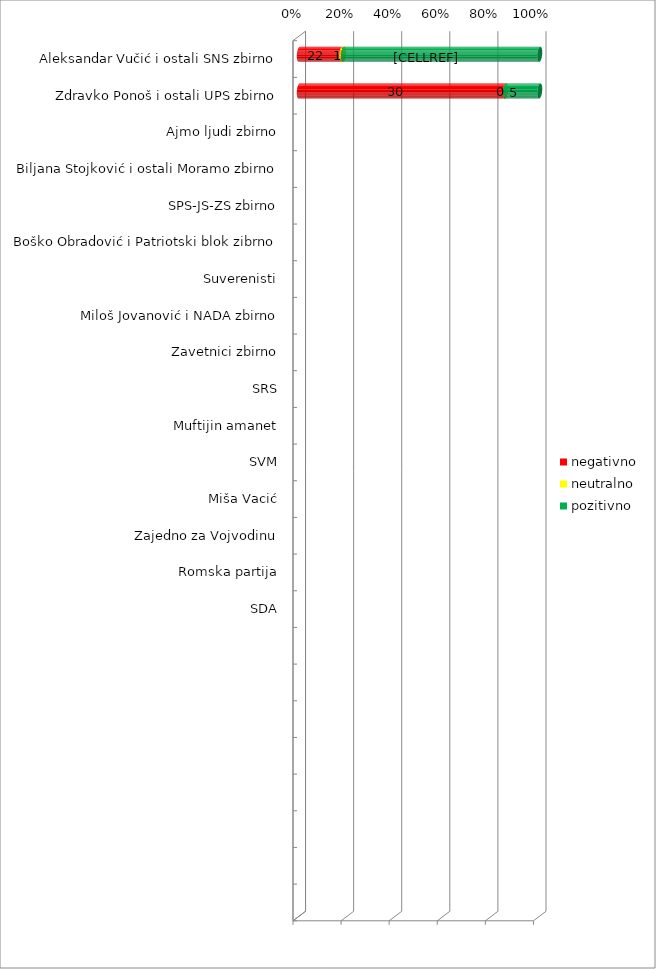
| Category | negativno | neutralno | pozitivno |
|---|---|---|---|
| Aleksandar Vučić i ostali SNS zbirno | 22 | 1 | 102 |
| Zdravko Ponoš i ostali UPS zbirno | 30 | 0 | 5 |
| Ajmo ljudi zbirno | 0 | 0 | 0 |
| Biljana Stojković i ostali Moramo zbirno | 0 | 0 | 0 |
| SPS-JS-ZS zbirno | 0 | 0 | 0 |
| Boško Obradović i Patriotski blok zibrno | 0 | 0 | 0 |
| Suverenisti | 0 | 0 | 0 |
| Miloš Jovanović i NADA zbirno | 0 | 0 | 0 |
| Zavetnici zbirno | 0 | 0 | 0 |
| SRS | 0 | 0 | 0 |
| Muftijin amanet | 0 | 0 | 0 |
| SVM | 0 | 0 | 0 |
| Miša Vacić | 0 | 0 | 0 |
| Zajedno za Vojvodinu | 0 | 0 | 0 |
| Romska partija | 0 | 0 | 0 |
| SDA | 0 | 0 | 0 |